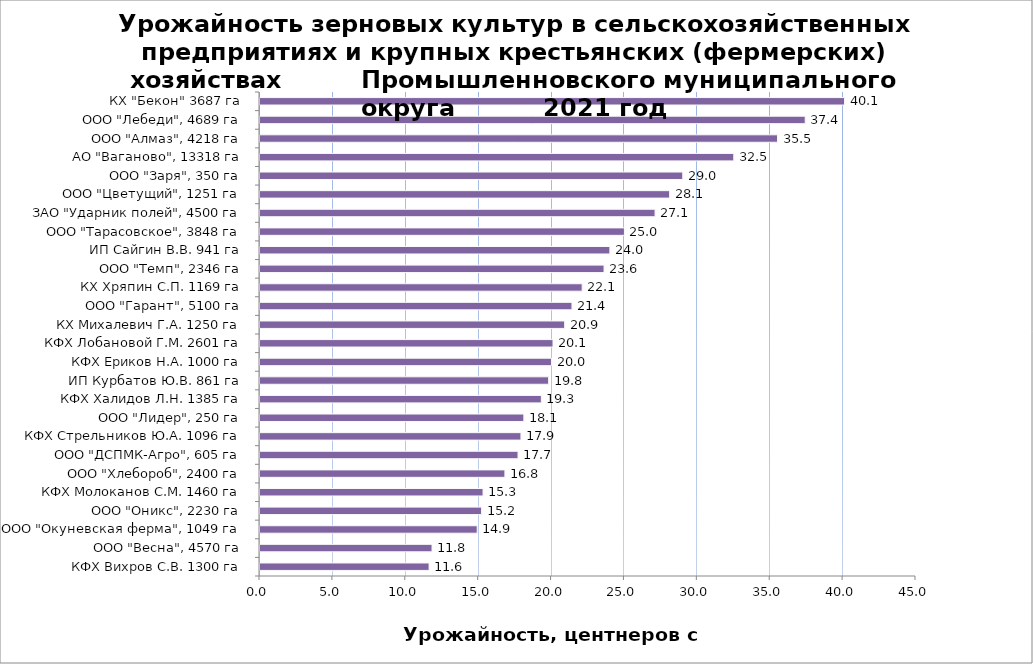
| Category | Series 0 |
|---|---|
| КФХ Вихров С.В. 1300 га | 11.6 |
| ООО "Весна", 4570 га | 11.8 |
| ООО "Окуневская ферма", 1049 га | 14.9 |
| ООО "Оникс", 2230 га | 15.2 |
| КФХ Молоканов С.М. 1460 га | 15.3 |
| ООО "Хлебороб", 2400 га | 16.8 |
| ООО "ДСПМК-Агро", 605 га | 17.7 |
| КФХ Стрельников Ю.А. 1096 га | 17.9 |
| ООО "Лидер", 250 га | 18.1 |
| КФХ Халидов Л.Н. 1385 га | 19.3 |
| ИП Курбатов Ю.В. 861 га | 19.8 |
| КФХ Ериков Н.А. 1000 га | 20 |
| КФХ Лобановой Г.М. 2601 га | 20.1 |
| КХ Михалевич Г.А. 1250 га | 20.9 |
| ООО "Гарант", 5100 га | 21.4 |
| КХ Хряпин С.П. 1169 га | 22.1 |
| ООО "Темп", 2346 га | 23.6 |
| ИП Сайгин В.В. 941 га | 24 |
| ООО "Тарасовское", 3848 га | 25 |
| ЗАО "Ударник полей", 4500 га | 27.1 |
| ООО "Цветущий", 1251 га | 28.1 |
| ООО "Заря", 350 га | 29 |
| АО "Ваганово", 13318 га | 32.5 |
| ООО "Алмаз", 4218 га | 35.5 |
| ООО "Лебеди", 4689 га | 37.4 |
| КХ "Бекон" 3687 га | 40.1 |